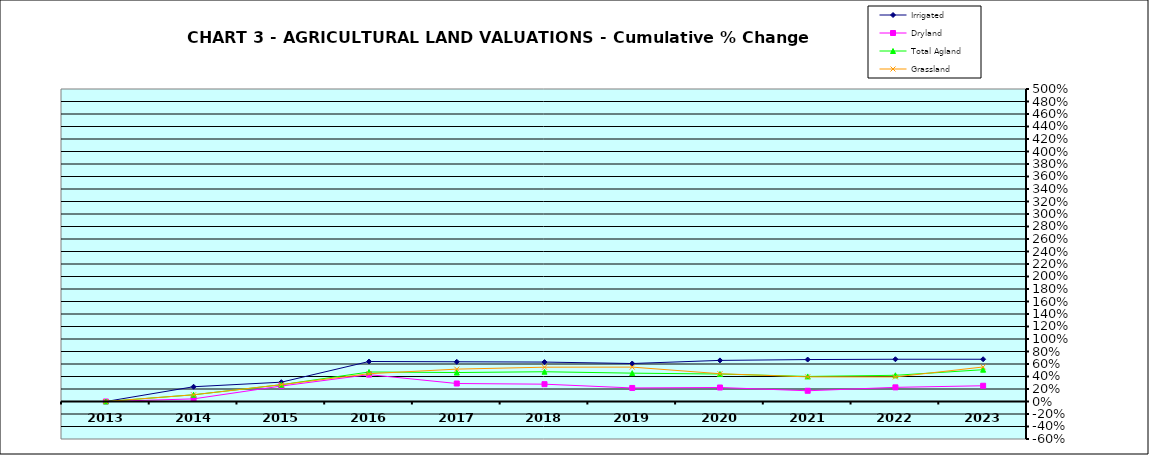
| Category | Irrigated | Dryland | Total Agland | Grassland |
|---|---|---|---|---|
| 2013.0 | 0 | 0 | 0 | 0 |
| 2014.0 | 0.236 | 0.042 | 0.108 | 0.107 |
| 2015.0 | 0.309 | 0.248 | 0.268 | 0.27 |
| 2016.0 | 0.64 | 0.43 | 0.472 | 0.445 |
| 2017.0 | 0.636 | 0.288 | 0.463 | 0.518 |
| 2018.0 | 0.631 | 0.277 | 0.476 | 0.549 |
| 2019.0 | 0.608 | 0.217 | 0.454 | 0.55 |
| 2020.0 | 0.658 | 0.224 | 0.439 | 0.444 |
| 2021.0 | 0.671 | 0.172 | 0.401 | 0.394 |
| 2022.0 | 0.676 | 0.226 | 0.419 | 0.393 |
| 2023.0 | 0.676 | 0.252 | 0.509 | 0.552 |